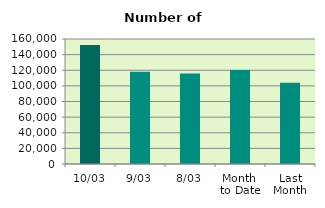
| Category | Series 0 |
|---|---|
| 10/03 | 152270 |
| 9/03 | 118046 |
| 8/03 | 115894 |
| Month 
to Date | 120192 |
| Last
Month | 103910.7 |